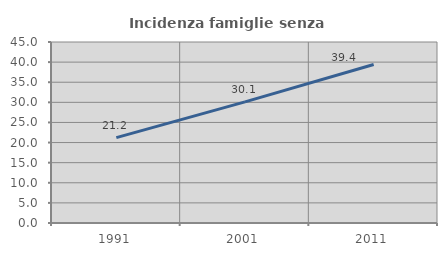
| Category | Incidenza famiglie senza nuclei |
|---|---|
| 1991.0 | 21.22 |
| 2001.0 | 30.108 |
| 2011.0 | 39.394 |